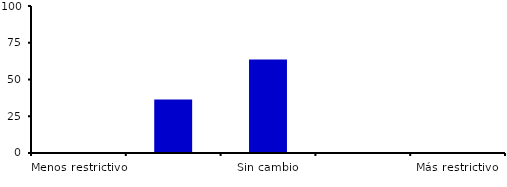
| Category | Series 0 |
|---|---|
| Menos restrictivo | 0 |
| Moderadamente menos restrictivo | 36.364 |
| Sin cambio | 63.636 |
| Moderadamente más restrictivo | 0 |
| Más restrictivo | 0 |